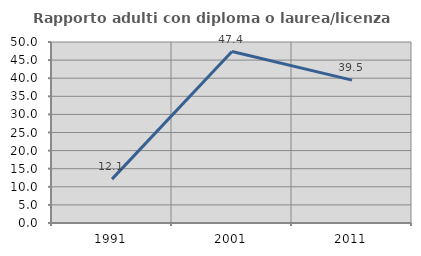
| Category | Rapporto adulti con diploma o laurea/licenza media  |
|---|---|
| 1991.0 | 12.121 |
| 2001.0 | 47.368 |
| 2011.0 | 39.474 |